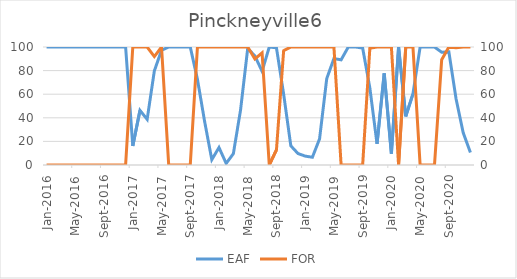
| Category | EAF |
|---|---|
| 2016-01-01 | 100 |
| 2016-02-01 | 100 |
| 2016-03-01 | 100 |
| 2016-04-01 | 100 |
| 2016-05-01 | 100 |
| 2016-06-01 | 100 |
| 2016-07-01 | 100 |
| 2016-08-01 | 100 |
| 2016-09-01 | 100 |
| 2016-10-01 | 100 |
| 2016-11-01 | 100 |
| 2016-12-01 | 100 |
| 2017-01-01 | 16.13 |
| 2017-02-01 | 46.28 |
| 2017-03-01 | 38.69 |
| 2017-04-01 | 79.74 |
| 2017-05-01 | 97.24 |
| 2017-06-01 | 100 |
| 2017-07-01 | 100 |
| 2017-08-01 | 100 |
| 2017-09-01 | 100 |
| 2017-10-01 | 72.62 |
| 2017-11-01 | 36.88 |
| 2017-12-01 | 4.51 |
| 2018-01-01 | 14.81 |
| 2018-02-01 | 1.34 |
| 2018-03-01 | 9.58 |
| 2018-04-01 | 46.58 |
| 2018-05-01 | 98.93 |
| 2018-06-01 | 92.36 |
| 2018-07-01 | 79.44 |
| 2018-08-01 | 100 |
| 2018-09-01 | 99.31 |
| 2018-10-01 | 60.09 |
| 2018-11-01 | 16.26 |
| 2018-12-01 | 9.7 |
| 2019-01-01 | 7.54 |
| 2019-02-01 | 6.56 |
| 2019-03-01 | 22.11 |
| 2019-04-01 | 73.23 |
| 2019-05-01 | 90.21 |
| 2019-06-01 | 89.13 |
| 2019-07-01 | 100 |
| 2019-08-01 | 100 |
| 2019-09-01 | 99.1 |
| 2019-10-01 | 65.36 |
| 2019-11-01 | 17.93 |
| 2019-12-01 | 77.7 |
| 2020-01-01 | 9.56 |
| 2020-02-01 | 100 |
| 2020-03-01 | 41.23 |
| 2020-04-01 | 60.19 |
| 2020-05-01 | 100 |
| 2020-06-01 | 100 |
| 2020-07-01 | 100 |
| 2020-08-01 | 95.49 |
| 2020-09-01 | 95.85 |
| 2020-10-01 | 56.09 |
| 2020-11-01 | 27.36 |
| 2020-12-01 | 10.64 |